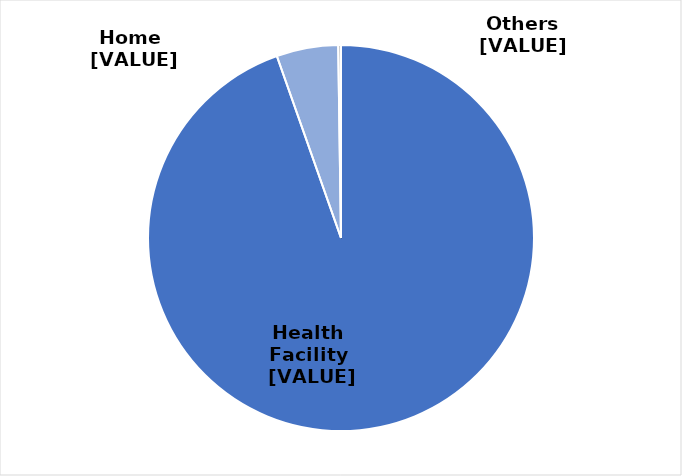
| Category | Series 0 |
|---|---|
|  Health Facility  | 94.605 |
|  Home  | 5.165 |
|  Others  | 0.23 |